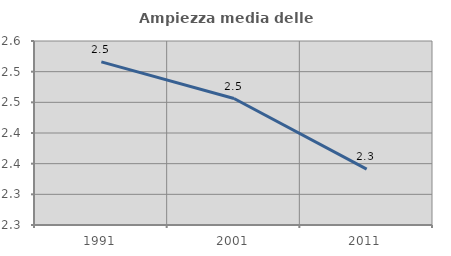
| Category | Ampiezza media delle famiglie |
|---|---|
| 1991.0 | 2.516 |
| 2001.0 | 2.456 |
| 2011.0 | 2.341 |